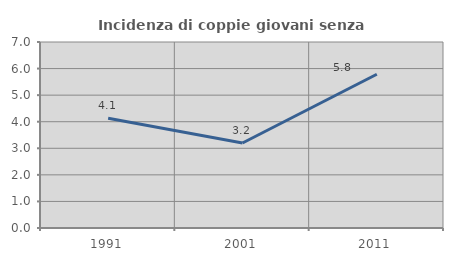
| Category | Incidenza di coppie giovani senza figli |
|---|---|
| 1991.0 | 4.132 |
| 2001.0 | 3.2 |
| 2011.0 | 5.785 |